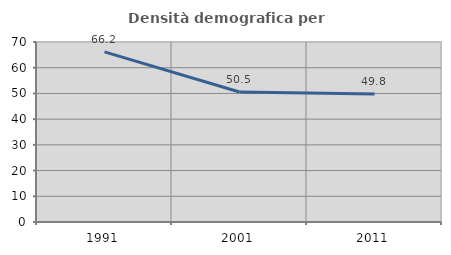
| Category | Densità demografica |
|---|---|
| 1991.0 | 66.168 |
| 2001.0 | 50.546 |
| 2011.0 | 49.757 |